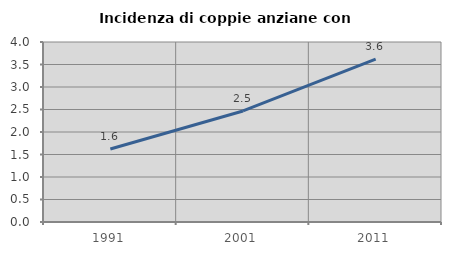
| Category | Incidenza di coppie anziane con figli |
|---|---|
| 1991.0 | 1.623 |
| 2001.0 | 2.467 |
| 2011.0 | 3.62 |